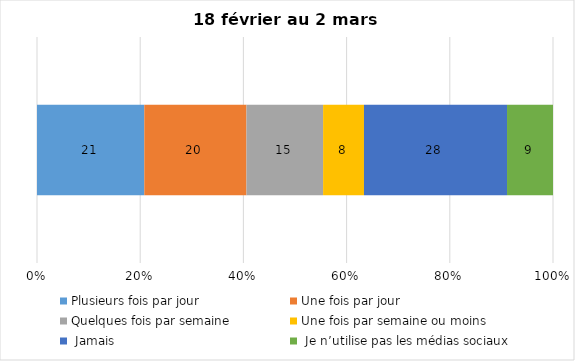
| Category | Plusieurs fois par jour | Une fois par jour | Quelques fois par semaine   | Une fois par semaine ou moins   |  Jamais   |  Je n’utilise pas les médias sociaux |
|---|---|---|---|---|---|---|
| 0 | 21 | 20 | 15 | 8 | 28 | 9 |